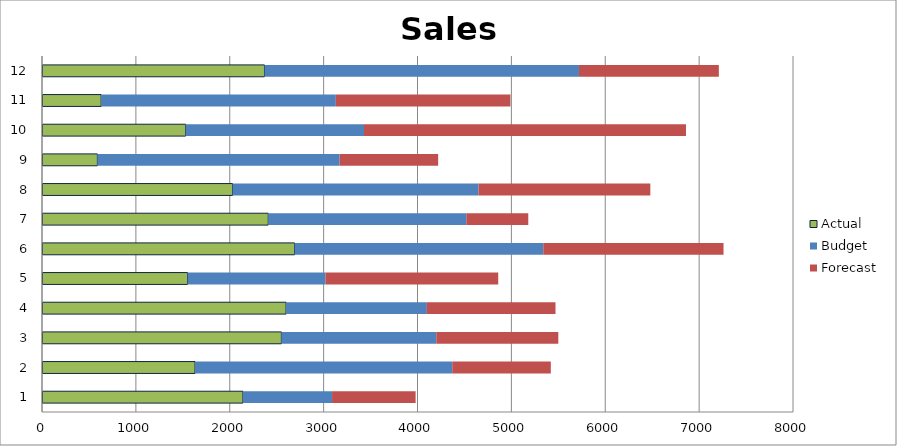
| Category | Actual | Budget | Forecast |
|---|---|---|---|
| 0 | 2140 | 950 | 890 |
| 1 | 1630 | 2740 | 1050 |
| 2 | 2550 | 1650 | 1300 |
| 3 | 2600 | 1500 | 1370 |
| 4 | 1550 | 1470 | 1840 |
| 5 | 2690 | 2650 | 1920 |
| 6 | 2410 | 2110 | 660 |
| 7 | 2030 | 2620 | 1830 |
| 8 | 590 | 2580 | 1050 |
| 9 | 1530 | 1900 | 3430 |
| 10 | 630 | 2500 | 1860 |
| 11 | 2370 | 3350 | 1490 |